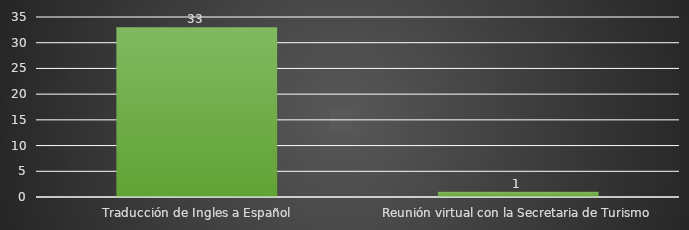
| Category | INDICADOR  |
|---|---|
| Traducción de Ingles a Español | 33 |
| Reunión virtual con la Secretaria de Turismo | 1 |